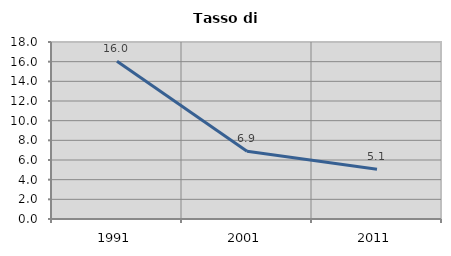
| Category | Tasso di disoccupazione   |
|---|---|
| 1991.0 | 16.038 |
| 2001.0 | 6.893 |
| 2011.0 | 5.058 |